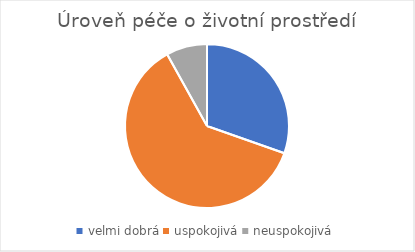
| Category | Úroveň péče o životní prostředí |
|---|---|
| velmi dobrá | 79 |
| uspokojivá | 160 |
| neuspokojivá | 21 |